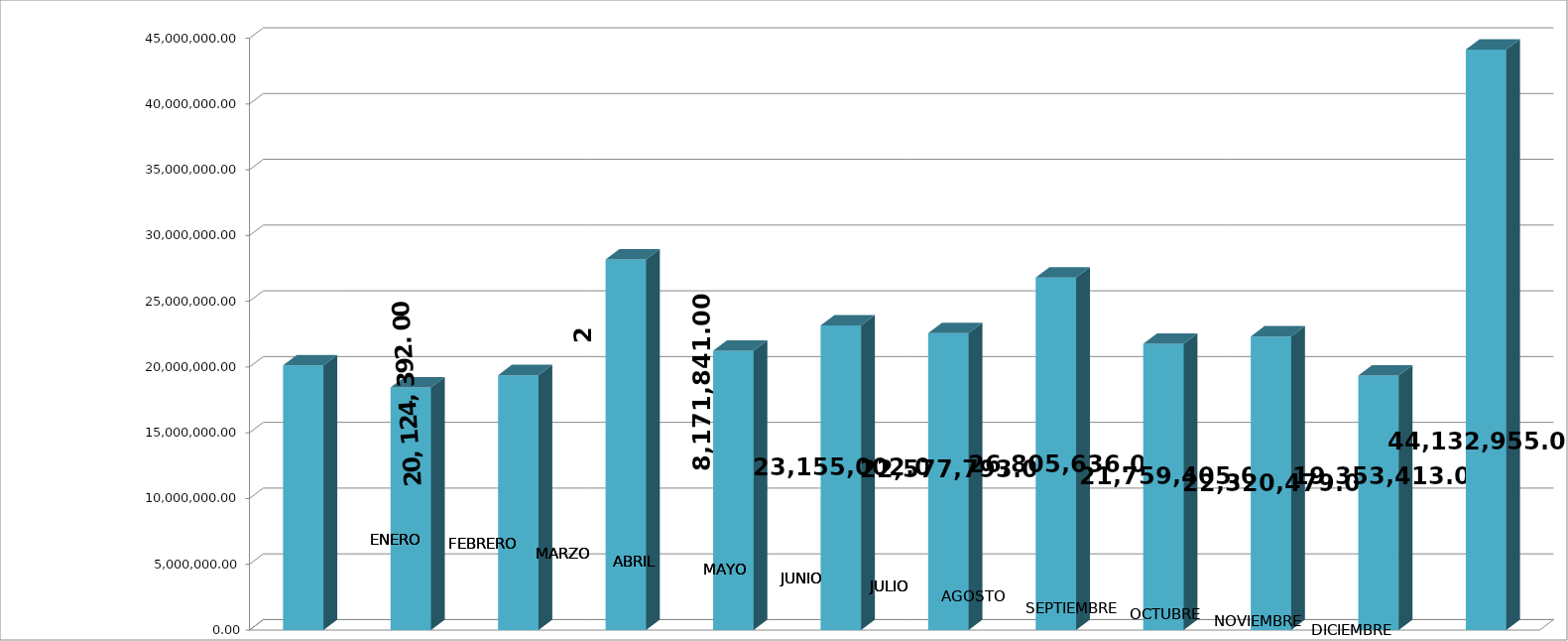
| Category | Series 0 |
|---|---|
| 0 | 20124392 |
| 1 | 18439004 |
| 2 | 19379017 |
| 3 | 28171841 |
| 4 | 21238346 |
| 5 | 23155002 |
| 6 | 22577793 |
| 7 | 26805636 |
| 8 | 21759405 |
| 9 | 22320479 |
| 10 | 19353413 |
| 11 | 44132955 |